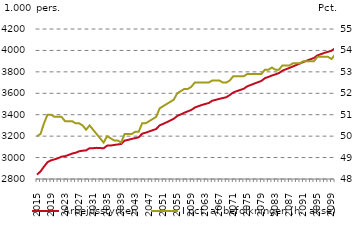
| Category | Arbejdsstyrken |
|---|---|
| 2015.0 | 2840.5 |
| 2016.0 | 2870.5 |
| 2017.0 | 2915.8 |
| 2018.0 | 2957.2 |
| 2019.0 | 2974.2 |
| 2020.0 | 2983.3 |
| 2021.0 | 2993.9 |
| 2022.0 | 3008.4 |
| 2023.0 | 3012.9 |
| 2024.0 | 3024.2 |
| 2025.0 | 3037.2 |
| 2026.0 | 3045 |
| 2027.0 | 3058.3 |
| 2028.0 | 3064.2 |
| 2029.0 | 3066.9 |
| 2030.0 | 3087.6 |
| 2031.0 | 3087.4 |
| 2032.0 | 3090.7 |
| 2033.0 | 3088.9 |
| 2034.0 | 3086.1 |
| 2035.0 | 3111.5 |
| 2036.0 | 3112.2 |
| 2037.0 | 3117.7 |
| 2038.0 | 3122 |
| 2039.0 | 3127 |
| 2040.0 | 3158.1 |
| 2041.0 | 3165.2 |
| 2042.0 | 3174.3 |
| 2043.0 | 3181.2 |
| 2044.0 | 3189 |
| 2045.0 | 3223.1 |
| 2046.0 | 3232.1 |
| 2047.0 | 3244.1 |
| 2048.0 | 3255.1 |
| 2049.0 | 3266.8 |
| 2050.0 | 3301.2 |
| 2051.0 | 3314.6 |
| 2052.0 | 3329.9 |
| 2053.0 | 3345.6 |
| 2054.0 | 3362 |
| 2055.0 | 3388.1 |
| 2056.0 | 3402.6 |
| 2057.0 | 3418.3 |
| 2058.0 | 3431.4 |
| 2059.0 | 3443.9 |
| 2060.0 | 3466.6 |
| 2061.0 | 3479 |
| 2062.0 | 3490.7 |
| 2063.0 | 3500.3 |
| 2064.0 | 3509.3 |
| 2065.0 | 3530.9 |
| 2066.0 | 3538.8 |
| 2067.0 | 3547.9 |
| 2068.0 | 3555.5 |
| 2069.0 | 3563.1 |
| 2070.0 | 3584.2 |
| 2071.0 | 3608 |
| 2072.0 | 3620.4 |
| 2073.0 | 3631.4 |
| 2074.0 | 3642.6 |
| 2075.0 | 3665.6 |
| 2076.0 | 3677.9 |
| 2077.0 | 3690.8 |
| 2078.0 | 3703.1 |
| 2079.0 | 3715.4 |
| 2080.0 | 3740.9 |
| 2081.0 | 3752.6 |
| 2082.0 | 3765.8 |
| 2083.0 | 3776.7 |
| 2084.0 | 3788.3 |
| 2085.0 | 3811.4 |
| 2086.0 | 3824 |
| 2087.0 | 3836.7 |
| 2088.0 | 3850.3 |
| 2089.0 | 3864.4 |
| 2090.0 | 3878.6 |
| 2091.0 | 3892.2 |
| 2092.0 | 3905.3 |
| 2093.0 | 3917.5 |
| 2094.0 | 3929.3 |
| 2095.0 | 3954.3 |
| 2096.0 | 3965.3 |
| 2097.0 | 3977.5 |
| 2098.0 | 3987.2 |
| 2099.0 | 3997 |
| 2100.0 | 4019.1 |